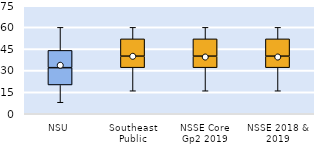
| Category | 25th | 50th | 75th |
|---|---|---|---|
| NSU | 20 | 12 | 12 |
| Southeast Public | 32 | 8 | 12 |
| NSSE Core Gp2 2019 | 32 | 8 | 12 |
| NSSE 2018 & 2019 | 32 | 8 | 12 |